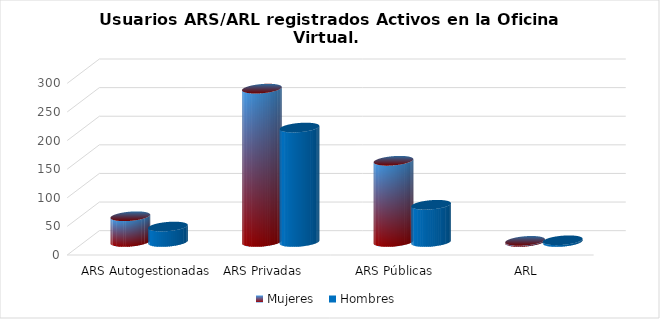
| Category | Mujeres | Hombres |
|---|---|---|
| ARS Autogestionadas | 45 | 27 |
| ARS Privadas | 268 | 200 |
| ARS Públicas | 142 | 65 |
| ARL | 2 | 3 |